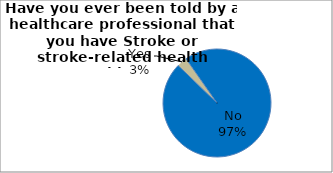
| Category | Series 0 |
|---|---|
| No | 96.948 |
| Yes | 3.052 |